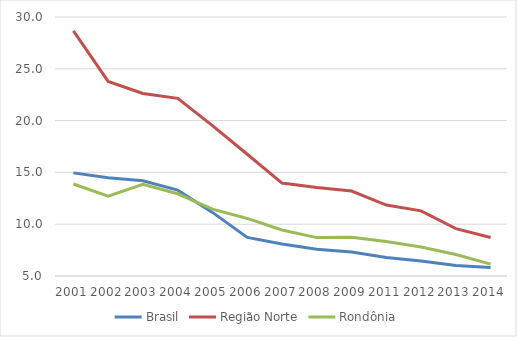
| Category | Brasil | Região Norte | Rondônia |
|---|---|---|---|
| 2001.0 | 14.955 | 28.66 | 13.88 |
| 2002.0 | 14.475 | 23.779 | 12.696 |
| 2003.0 | 14.19 | 22.619 | 13.841 |
| 2004.0 | 13.285 | 22.145 | 12.937 |
| 2005.0 | 11.14 | 19.518 | 11.455 |
| 2006.0 | 8.721 | 16.753 | 10.556 |
| 2007.0 | 8.08 | 13.97 | 9.444 |
| 2008.0 | 7.593 | 13.543 | 8.707 |
| 2009.0 | 7.309 | 13.198 | 8.738 |
| 2011.0 | 6.776 | 11.848 | 8.336 |
| 2012.0 | 6.452 | 11.29 | 7.808 |
| 2013.0 | 6.009 | 9.568 | 7.076 |
| 2014.0 | 5.816 | 8.718 | 6.15 |